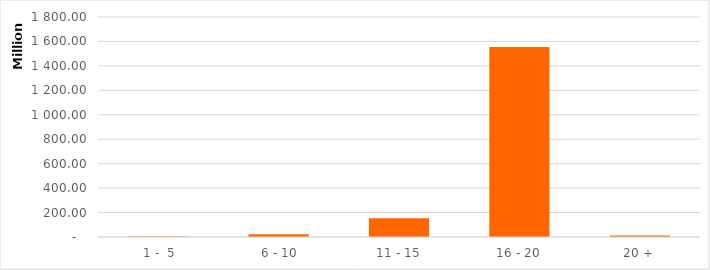
| Category | Series 0 |
|---|---|
|  1 -  5 | 4941260.65 |
|  6 - 10 | 21668061.78 |
| 11 - 15 | 153027097.71 |
| 16 - 20 | 1554381867.31 |
| 20 + | 12634715.29 |